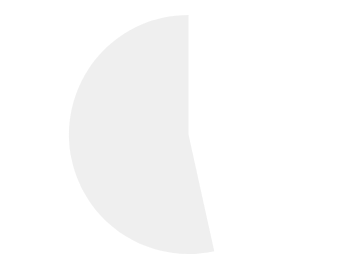
| Category | Series 0 |
|---|---|
| 0 | 0.465 |
| 1 | 0.535 |